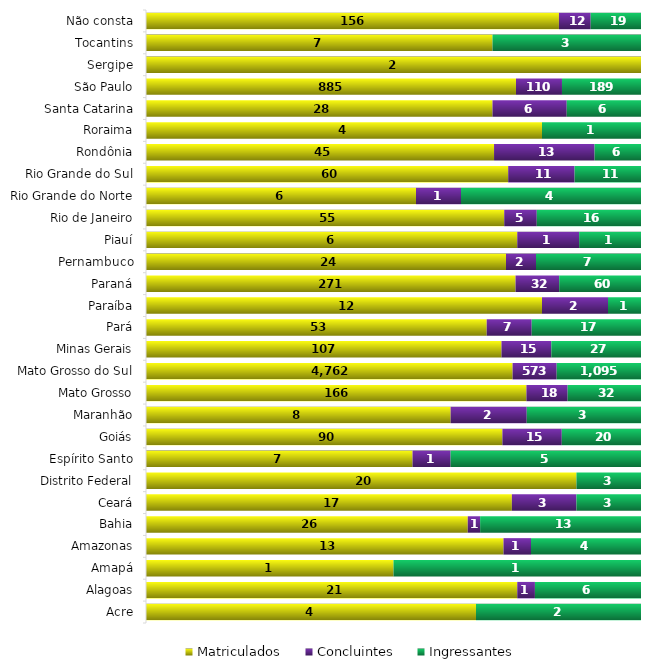
| Category | Matriculados | Concluintes | Ingressantes |
|---|---|---|---|
| 0 | 4 | 0 | 2 |
| 1 | 21 | 1 | 6 |
| 2 | 1 | 0 | 1 |
| 3 | 13 | 1 | 4 |
| 4 | 26 | 1 | 13 |
| 5 | 17 | 3 | 3 |
| 6 | 20 | 0 | 3 |
| 7 | 7 | 1 | 5 |
| 8 | 90 | 15 | 20 |
| 9 | 8 | 2 | 3 |
| 10 | 166 | 18 | 32 |
| 11 | 4762 | 573 | 1095 |
| 12 | 107 | 15 | 27 |
| 13 | 53 | 7 | 17 |
| 14 | 12 | 2 | 1 |
| 15 | 271 | 32 | 60 |
| 16 | 24 | 2 | 7 |
| 17 | 6 | 1 | 1 |
| 18 | 55 | 5 | 16 |
| 19 | 6 | 1 | 4 |
| 20 | 60 | 11 | 11 |
| 21 | 45 | 13 | 6 |
| 22 | 4 | 0 | 1 |
| 23 | 28 | 6 | 6 |
| 24 | 885 | 110 | 189 |
| 25 | 2 | 0 | 0 |
| 26 | 7 | 0 | 3 |
| 27 | 156 | 12 | 19 |